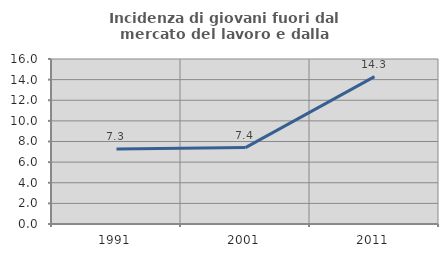
| Category | Incidenza di giovani fuori dal mercato del lavoro e dalla formazione  |
|---|---|
| 1991.0 | 7.273 |
| 2001.0 | 7.407 |
| 2011.0 | 14.286 |